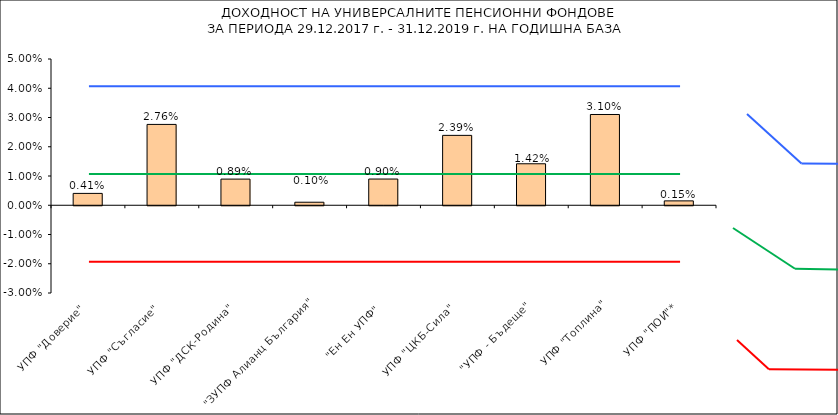
| Category | Series 0 |
|---|---|
| УПФ "Доверие"  | 0.004 |
| УПФ "Съгласие"  | 0.028 |
| УПФ "ДСК-Родина"  | 0.009 |
| "ЗУПФ Алианц България" | 0.001 |
| "Eн Ен УПФ"  | 0.009 |
| УПФ "ЦКБ-Сила"  | 0.024 |
| "УПФ - Бъдеще" | 0.014 |
| УПФ "Топлина" | 0.031 |
| УПФ "ПОИ"* | 0.001 |